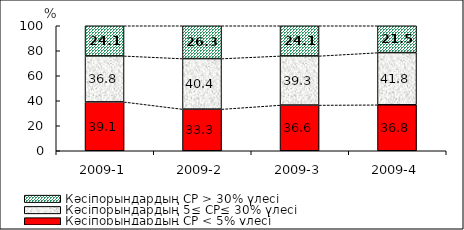
| Category | Кәсіпорындардың СР < 5% үлесі | Кәсіпорындардың 5≤ СР≤ 30% үлесі | Кәсіпорындардың СР > 30% үлесі |
|---|---|---|---|
| 2009-1 | 39.086 | 36.799 | 24.115 |
| 2009-2 | 33.309 | 40.436 | 26.255 |
| 2009-3 | 36.551 | 39.334 | 24.115 |
| 2009-4 | 36.765 | 41.765 | 21.471 |